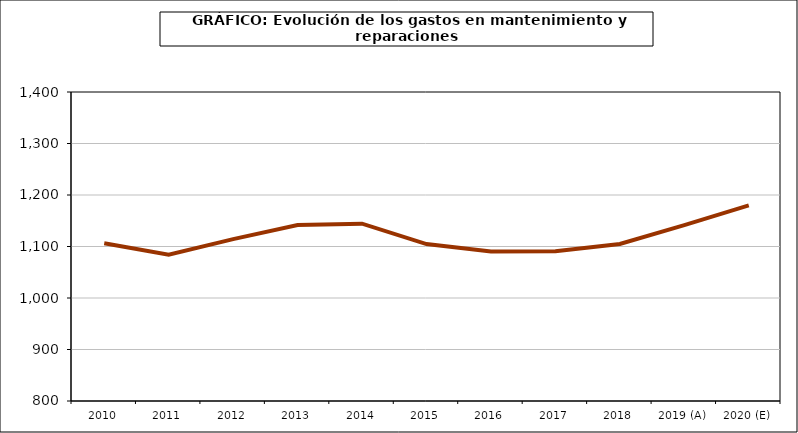
| Category | Series 0 |
|---|---|
| 2010 | 1106.325 |
| 2011 | 1083.98 |
| 2012 | 1114.377 |
| 2013 | 1141.575 |
| 2014 | 1144.341 |
| 2015 | 1104.719 |
| 2016 | 1090.39 |
| 2017 | 1090.889 |
| 2018 | 1104.884 |
| 2019 (A) | 1141.633 |
| 2020 (E) | 1179.774 |